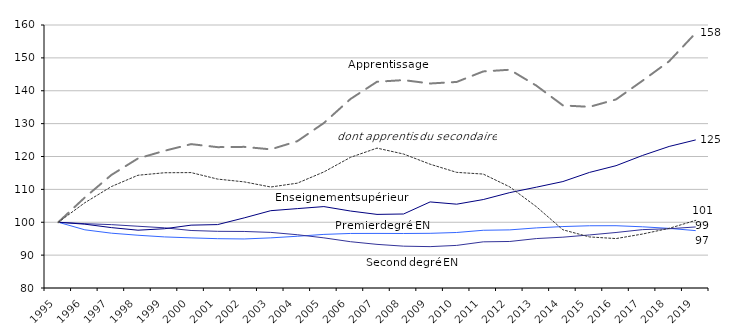
| Category | Premier degré Éducation nationale | Second degré Éducation nationale | Enseignement supérieur | Apprentissage | dont apprentis du secondaire |
|---|---|---|---|---|---|
| 1995.0 | 100 | 100 | 100 | 100 | 100 |
| 1996.0 | 97.701 | 99.565 | 99.411 | 107.538 | 105.937 |
| 1997.0 | 96.674 | 99.276 | 98.374 | 114.392 | 110.856 |
| 1998.0 | 96.047 | 98.786 | 97.583 | 119.404 | 114.296 |
| 1999.0 | 95.538 | 98.305 | 98.032 | 121.731 | 115.057 |
| 2000.0 | 95.251 | 97.494 | 99.12 | 123.765 | 115.106 |
| 2001.0 | 95.003 | 97.242 | 99.287 | 122.844 | 113.126 |
| 2002.0 | 94.919 | 97.198 | 101.33 | 122.933 | 112.282 |
| 2003.0 | 95.25 | 96.914 | 103.52 | 122.173 | 110.72 |
| 2004.0 | 95.737 | 96.207 | 104.146 | 124.654 | 111.891 |
| 2005.0 | 96.306 | 95.254 | 104.764 | 130.189 | 115.302 |
| 2006.0 | 96.59 | 94.083 | 103.414 | 137.485 | 119.735 |
| 2007.0 | 96.604 | 93.273 | 102.389 | 142.739 | 122.553 |
| 2008.0 | 96.582 | 92.724 | 102.511 | 143.24 | 120.754 |
| 2009.0 | 96.633 | 92.585 | 106.18 | 142.205 | 117.659 |
| 2010.0 | 96.883 | 92.958 | 105.497 | 142.678 | 115.175 |
| 2011.0 | 97.558 | 94.041 | 106.905 | 145.88 | 114.653 |
| 2012.0 | 97.677 | 94.152 | 109.02 | 146.393 | 110.748 |
| 2013.0 | 98.284 | 95.034 | 110.669 | 141.557 | 104.736 |
| 2014.0 | 98.69 | 95.457 | 112.377 | 135.533 | 97.702 |
| 2015.0 | 98.932 | 96.139 | 115.158 | 135.103 | 95.539 |
| 2016.0 | 98.949 | 96.885 | 117.209 | 137.359 | 95.034 |
| 2017.0 | 98.613 | 97.76 | 120.325 | 143.07 | 96.42 |
| 2018.0 | 98.133 | 98.025 | 123.058 | 148.973 | 98.148 |
| 2019.0 | 97.457 | 98.571 | 125.046 | 157.58 | 100.574 |